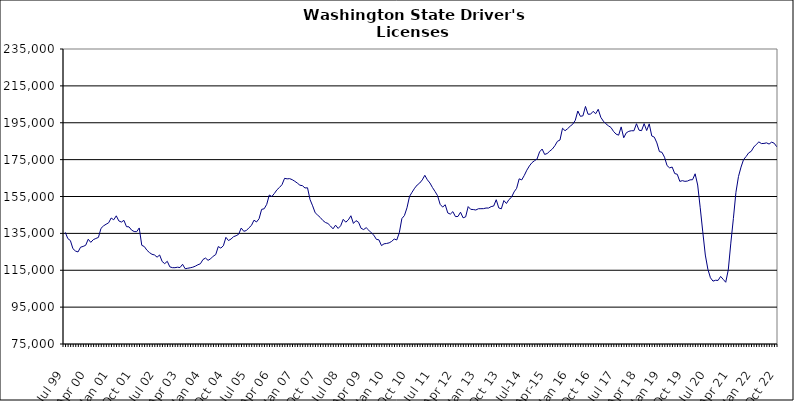
| Category | Series 0 |
|---|---|
| Jul 99 | 135560 |
| Aug 99 | 132182 |
| Sep 99 | 131104 |
| Oct 99 | 126694 |
| Nov 99 | 125425 |
| Dec 99 | 124927 |
| Jan 00 | 127499 |
| Feb 00 | 127927 |
| Mar 00 | 128547 |
| Apr 00 | 131834 |
| May 00 | 130120 |
| Jun 00 | 131595 |
| Jul 00 | 132236 |
| Aug 00 | 132819 |
| Sep 00 | 137711 |
| Oct 00 | 139063 |
| Nov 00 | 139952 |
| Dec 00 | 140732 |
| Jan 01 | 143338 |
| Feb 01 | 142359 |
| Mar 01 | 144523 |
| Apr 01 | 141758 |
| May 01 | 141135 |
| Jun 01 | 142064 |
| Jul 01 | 138646 |
| Aug 01 | 138530 |
| Sep 01 | 136784 |
| Oct 01 | 135996 |
| Nov 01 | 135917 |
| Dec 01 | 137940 |
| Jan 02 | 128531 |
| Feb 02 | 127848 |
| Mar 02 | 125876 |
| Apr 02 | 124595 |
| May 02 | 123660 |
| Jun 02 | 123282 |
| Jul 02 | 122089 |
| Aug 02 | 123279 |
| Sep 02 | 119727 |
| Oct 02 | 118588 |
| Nov 02 | 119854 |
| Dec 02 | 116851 |
| Jan 03 | 116407 |
| Feb 03 | 116382 |
| Mar 03 | 116648 |
| Apr 03 | 116471 |
| May 03 | 118231 |
| Jun 03 | 115831 |
| Jul 03 | 116082 |
| Aug 03 | 116341 |
| Sep 03 | 116653 |
| Oct 03 | 117212 |
| Nov 03 | 117962 |
| Dec 03 | 118542 |
| Jan 04 | 120817 |
| Feb 04 | 121617 |
| Mar 04 | 120369 |
| Apr 04 | 121200 |
| May 04 | 122609 |
| Jun 04 | 123484 |
| Jul 04 | 127844 |
| Aug 04 | 127025 |
| Sep 04 | 128273 |
| Oct 04 | 132853 |
| Nov 04 | 131106 |
| Dec 04 | 131935 |
| Jan 05 | 133205 |
| Feb 05 | 133736 |
| Mar 05 | 134528 |
| Apr 05 | 137889 |
| May 05 | 136130 |
| Jun 05 | 136523 |
| Jul 05 | 137997 |
| Aug 05 | 139294 |
| Sep 05 | 142140 |
| Oct 05 | 141192 |
| Nov 05 | 142937 |
| Dec 05 | 148013 |
| Jan 06 | 148341 |
| Feb 06 | 150744 |
| Mar 06 | 155794 |
| Apr 06 | 154984 |
| May 06 | 156651 |
| Jun 06 | 158638 |
| Jul 06 | 159911 |
| Aug 06 | 161445 |
| Sep 06 | 164852 |
| Oct 06 | 164570 |
| Nov 06 | 164679 |
| Dec 06 | 164127 |
| Jan 07 | 163271 |
| Feb 07 | 162273 |
| Mar 07 | 161140 |
| Apr 07 | 160860 |
| May 07 | 159633 |
| Jun 07 | 159724 |
| Jul 07 | 153303 |
| Aug 07 | 149939 |
| Sep 07 | 146172 |
| Oct 07 | 144876 |
| Nov 07 | 143613 |
| Dec 07 | 142022 |
| Jan 08 | 140909 |
| Feb 08 | 140368 |
| Mar 08 | 138998 |
| Apr 08 | 137471 |
| May 08 | 139453 |
| Jun 08 | 137680 |
| Jul 08 | 139120 |
| Aug 08 | 142612 |
| Sep-08 | 141071 |
| Oct 08 | 142313 |
| Nov 08 | 144556 |
| Dec 08 | 140394 |
| Jan 09 | 141903 |
| Feb 09 | 141036 |
| Mar 09 | 137751 |
| Apr 09 | 137060 |
| May 09 | 138101 |
| Jun 09 | 136739 |
| Jul 09 | 135317 |
| Aug 09 | 134020 |
| Sep 09 | 131756 |
| Oct 09 | 131488 |
| Nov 09 | 128370 |
| Dec 09 | 129323 |
| Jan 10 | 129531 |
| Feb 10 | 129848 |
| Mar 10 | 130654 |
| Apr 10 | 131929 |
| May 10 | 131429 |
| Jun 10 | 135357 |
| Jul 10 | 143032 |
| Aug 10 | 144686 |
| Sep 10 | 148856 |
| Oct 10 | 155042 |
| Nov 10 | 157328 |
| Dec 10 | 159501 |
| Jan 11 | 161221 |
| Feb 11 | 162312 |
| Mar 11 | 163996 |
| Apr 11 | 166495 |
| May 11 | 164040 |
| Jun 11 | 162324 |
| Jul 11 | 159862 |
| Aug 11 | 157738 |
| Sep 11 | 155430 |
| Oct 11 | 150762 |
| Nov 11 | 149255 |
| Dec 11 | 150533 |
| Jan 12 | 146068 |
| Feb 12 | 145446 |
| Mar 12 | 146788 |
| Apr 12 | 144110 |
| May 12 | 144162 |
| Jun 12 | 146482 |
| Jul 12 | 143445 |
| Aug 12 | 143950 |
| Sep 12 | 149520 |
| Oct 12 | 148033 |
| Nov 12 | 147926 |
| Dec 12 | 147674 |
| Jan 13 | 148360 |
| Feb-13 | 148388 |
| Mar-13 | 148414 |
| Apr 13 | 148749 |
| May 13 | 148735 |
| Jun-13 | 149521 |
| Jul 13 | 149837 |
| Aug 13 | 153252 |
| Sep 13 | 148803 |
| Oct 13 | 148315 |
| Nov 13 | 152804 |
| Dec 13 | 151209 |
| Jan 14 | 153357 |
| Feb-14 | 154608 |
| Mar 14 | 157479 |
| Apr 14 | 159441 |
| May 14 | 164591 |
| Jun 14 | 163995 |
| Jul-14 | 166411 |
| Aug-14 | 169272 |
| Sep 14 | 171565 |
| Oct 14 | 173335 |
| Nov 14 | 174406 |
| Dec 14 | 175302 |
| Jan 15 | 179204 |
| Feb 15 | 180737 |
| Mar 15 | 177810 |
| Apr-15 | 178331 |
| May 15 | 179601 |
| Jun-15 | 180729 |
| Jul 15 | 182540 |
| Aug 15 | 184924 |
| Sep 15 | 185620 |
| Oct 15 | 192002 |
| Nov 15 | 190681 |
| Dec 15 | 191795 |
| Jan 16 | 193132 |
| Feb 16 | 194206 |
| Mar 16 | 196319 |
| Apr 16 | 201373 |
| May 16 | 198500 |
| Jun 16 | 198743 |
| Jul 16 | 203841 |
| Aug 16 | 199630 |
| Sep 16 | 199655 |
| Oct 16 | 201181 |
| Nov 16 | 199888 |
| Dec 16 | 202304 |
| Jan 17 | 197977 |
| Feb 17 | 195889 |
| Mar 17 | 194438 |
| Apr 17 | 193335 |
| May 17 | 192430 |
| Jun 17 | 190298 |
| Jul 17 | 188832 |
| Aug 17 | 188264 |
| Sep 17 | 192738 |
| Oct 17 | 186856 |
| Nov 17 | 189537 |
| Dec 17 | 190341 |
| Jan 18 | 190670 |
| Feb 18 | 190645 |
| Mar 18 | 194476 |
| Apr 18 | 190971 |
| May 18 | 190707 |
| Jun 18 | 194516 |
| Jul 18 | 190783 |
| Aug 18 | 194390 |
| Sep 18 | 187831 |
| Oct 18 | 187188 |
| Nov 18 | 184054 |
| Dec 18 | 179347 |
| Jan 19 | 178958 |
| Feb 19 | 176289 |
| Mar 19 | 171747 |
| Apr 19 | 170532 |
| May 19 | 170967 |
| Jun 19 | 167444 |
| Jul 19 | 167059 |
| Aug 19 | 163194 |
| Sep 19 | 163599 |
| Oct 19 | 163212 |
| Nov 19 | 163388 |
| Dec 19 | 164024 |
| Jan 20 | 164114 |
| Feb 20 | 167320 |
| Mar 20 | 161221 |
| Apr 20 | 148866 |
| May 20 | 135821 |
| Jun 20 | 123252 |
| Jul 20 | 115526 |
| Aug 20 | 110940 |
| Sep 20 | 109099 |
| Oct 20 | 109566 |
| Nov 20 | 109488 |
| Dec 20 | 111658 |
| Jan 21 | 110070 |
| Feb 21 | 108491 |
| Mar 21 | 115176 |
| Apr 21 | 129726 |
| May 21 | 143052 |
| Jun 21 | 157253 |
| Jul 21 | 165832 |
| Aug 21 | 170937 |
| Sep 21 | 175042 |
| Oct 21 | 176696 |
| Nov 21 | 178677 |
| Dec 21 | 179501 |
| Jan 22 | 181825 |
| Feb 22 | 183258 |
| Mar 22 | 184618 |
| Apr 22 | 183710 |
| May 22 | 183784 |
| Jun 22 | 184101 |
| Jul 22 | 183443 |
| Aug 22 | 184475 |
| Sep 22 | 183902 |
| Oct 22 | 181994 |